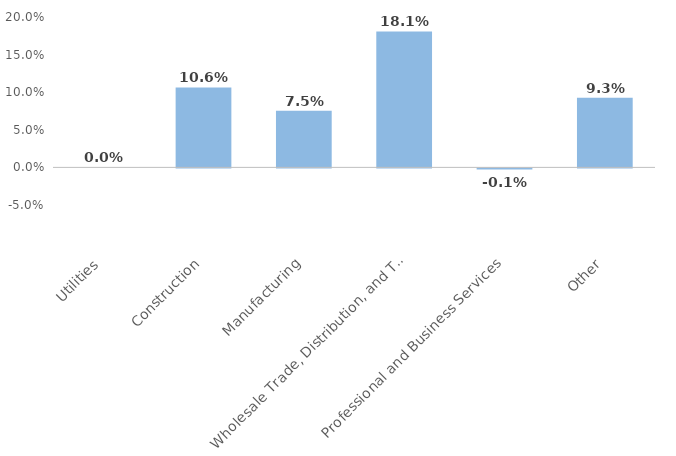
| Category | Series 0 |
|---|---|
| Utilities | 0 |
| Construction | 0.106 |
| Manufacturing | 0.075 |
| Wholesale Trade, Distribution, and Transport | 0.181 |
| Professional and Business Services | -0.001 |
| Other | 0.093 |